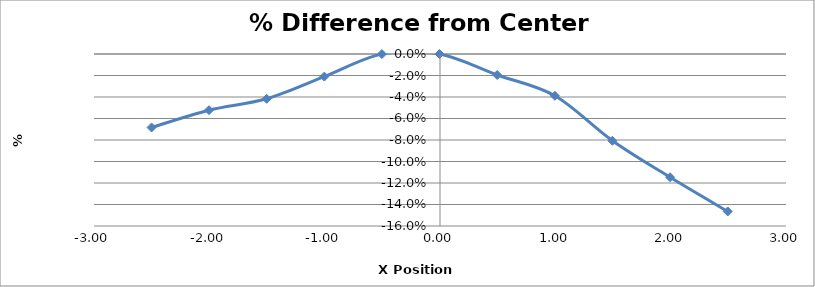
| Category | Series 0 |
|---|---|
| -2.5010000000000003 | -0.068 |
| -2.003 | -0.052 |
| -1.5030000000000001 | -0.042 |
| -1.0030000000000001 | -0.021 |
| -0.5040000000000004 | 0 |
| -0.004000000000000448 | 0 |
| 0.49599999999999955 | -0.02 |
| 0.9959999999999996 | -0.039 |
| 1.495 | -0.081 |
| 1.995 | -0.115 |
| 2.495 | -0.146 |